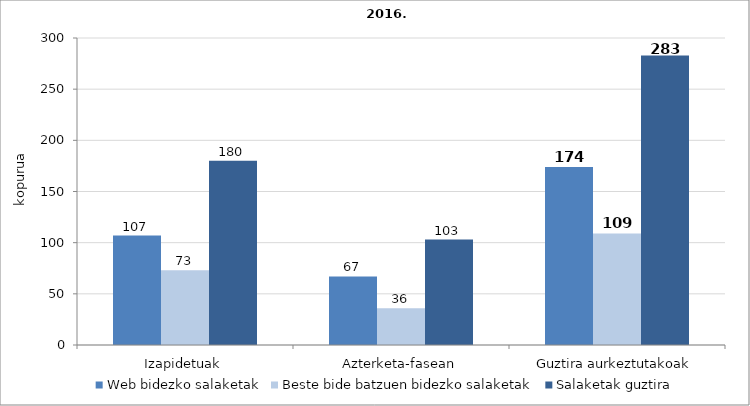
| Category | Web bidezko salaketak | Beste bide batzuen bidezko salaketak | Salaketak guztira |
|---|---|---|---|
| Izapidetuak | 107 | 73 | 180 |
| Azterketa-fasean | 67 | 36 | 103 |
| Guztira aurkeztutakoak | 174 | 109 | 283 |